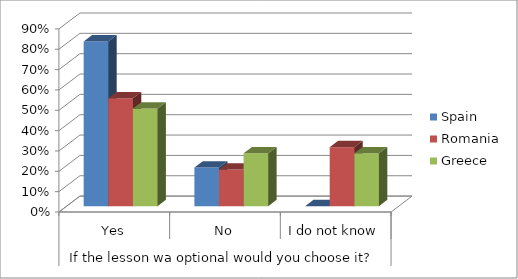
| Category | Spain | Romania | Greece |
|---|---|---|---|
| 0 | 0.81 | 0.53 | 0.48 |
| 1 | 0.19 | 0.18 | 0.26 |
| 2 | 0 | 0.29 | 0.26 |